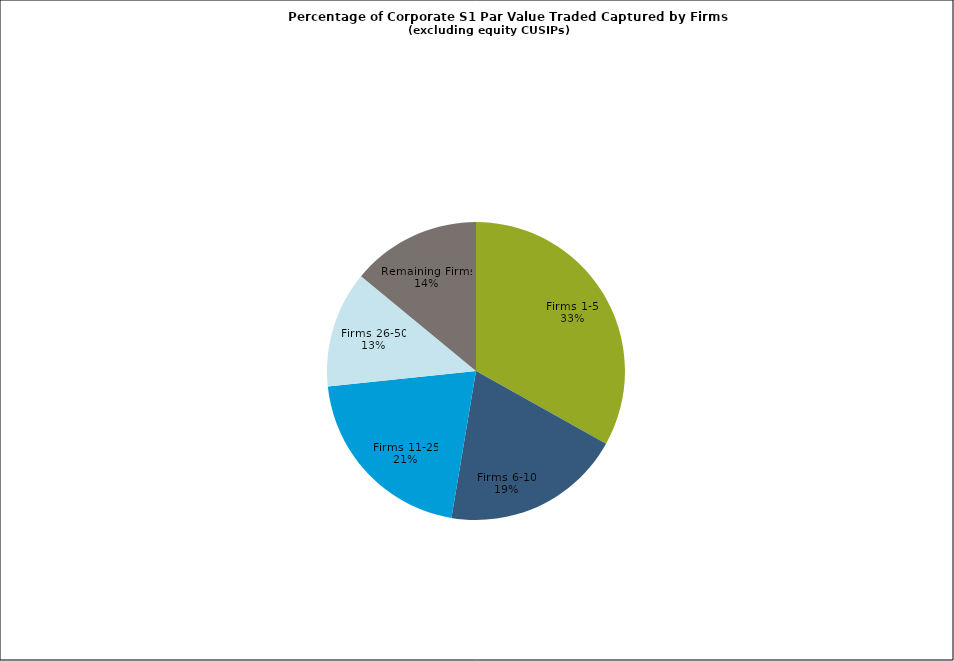
| Category | Series 0 |
|---|---|
| Firms 1-5 | 0.331 |
| Firms 6-10 | 0.195 |
| Firms 11-25 | 0.207 |
| Firms 26-50 | 0.126 |
| Remaining Firms | 0.14 |